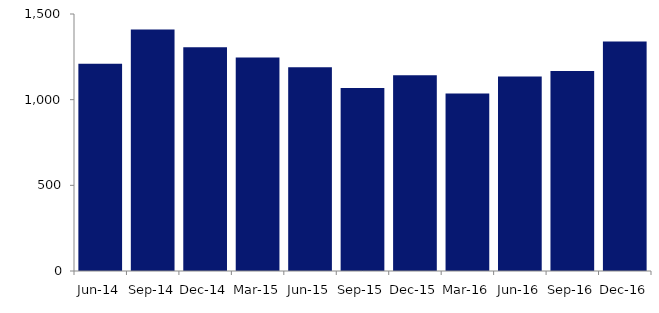
| Category | Series 0 |
|---|---|
| Jun-14 | 1210 |
| Sep-14 | 1410 |
| Dec-14 | 1306 |
| Mar-15 | 1246 |
| Jun-15 | 1189 |
| Sep-15 | 1068 |
| Dec-15 | 1143 |
| Mar-16 | 1036 |
| Jun-16 | 1135 |
| Sep-16 | 1168 |
| Dec-16 | 1339 |